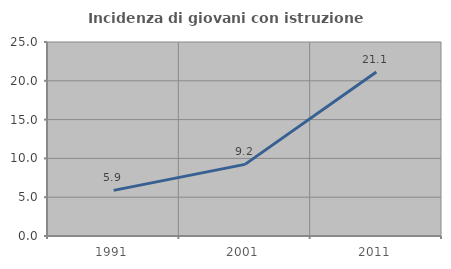
| Category | Incidenza di giovani con istruzione universitaria |
|---|---|
| 1991.0 | 5.882 |
| 2001.0 | 9.231 |
| 2011.0 | 21.127 |